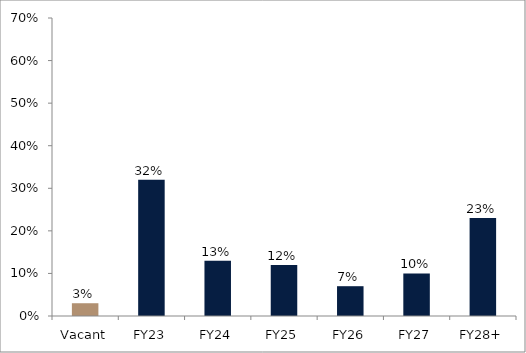
| Category | Series 0 |
|---|---|
| Vacant | 0.03 |
| FY23 | 0.32 |
| FY24 | 0.13 |
| FY25 | 0.12 |
| FY26 | 0.07 |
| FY27 | 0.1 |
| FY28+ | 0.23 |